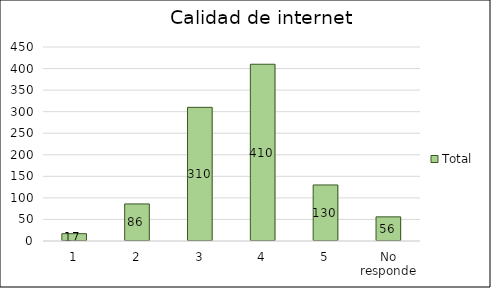
| Category | Total |
|---|---|
| 1 | 17 |
| 2 | 86 |
| 3 | 310 |
| 4 | 410 |
| 5 | 130 |
| No responde | 56 |